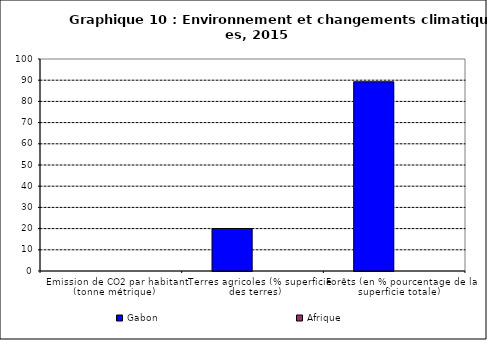
| Category | Gabon | Afrique |
|---|---|---|
| Emission de CO2 par habitant (tonne métrique) | 0 | 0 |
| Terres agricoles (% superficie des terres) | 20.026 | 0 |
| Forêts (en % pourcentage de la superficie totale) | 89.261 | 0 |